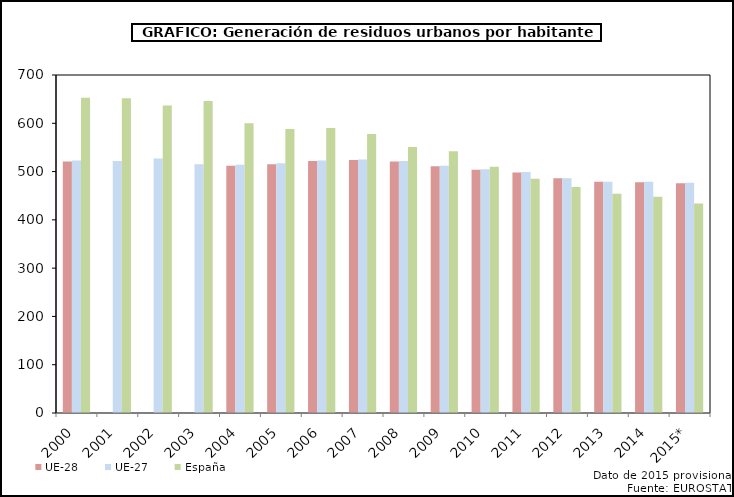
| Category | UE-28 | UE-27 | España |
|---|---|---|---|
| 2000 | 521 | 523 | 653 |
| 2001 | 0 | 522 | 652 |
| 2002 | 0 | 527 | 637 |
| 2003 | 0 | 515 | 646 |
| 2004 | 512 | 514 | 600 |
| 2005 | 515 | 517 | 588 |
| 2006 | 522 | 523 | 590 |
| 2007 | 524 | 525 | 578 |
| 2008 | 521 | 522 | 551 |
| 2009 | 511 | 512 | 542 |
| 2010 | 504 | 505 | 510 |
| 2011 | 498 | 499 | 485 |
| 2012 | 486 | 486 | 468 |
| 2013 | 479 | 479 | 454 |
| 2014 | 478 | 479 | 448 |
| 2015* | 476 | 477 | 434 |